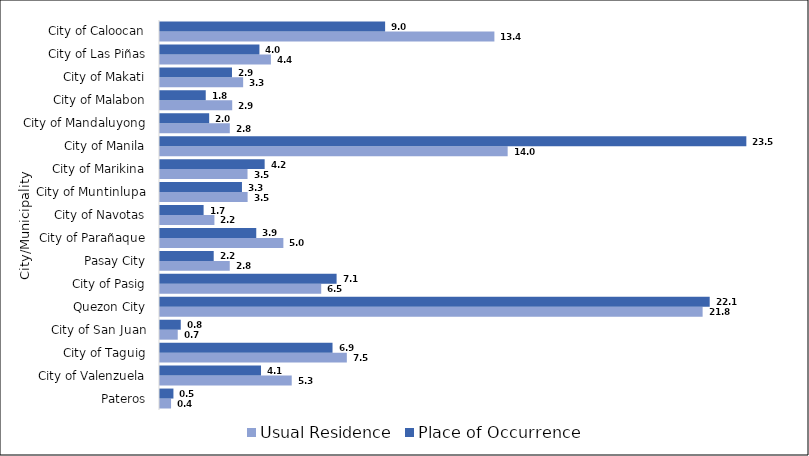
| Category |  Usual Residence  |  Place of Occurrence  |
|---|---|---|
|  Pateros | 0.444 | 0.539 |
|  City of Valenzuela | 5.286 | 4.054 |
|  City of Taguig | 7.498 | 6.923 |
|  City of San Juan | 0.712 | 0.833 |
|  Quezon City | 21.774 | 22.058 |
|  City of Pasig | 6.469 | 7.087 |
|  Pasay City | 2.799 | 2.155 |
|  City of Parañaque | 4.951 | 3.863 |
|  City of Navotas | 2.183 | 1.75 |
|  City of Muntinlupa | 3.516 | 3.289 |
|  City of Marikina | 3.512 | 4.2 |
|  City of Manila | 13.951 | 23.529 |
|  City of Mandaluyong | 2.801 | 1.973 |
|  City of Malabon | 2.898 | 1.835 |
|  City of Makati | 3.337 | 2.888 |
|  City of Las Piñas | 4.45 | 3.99 |
|  City of Caloocan | 13.419 | 9.034 |